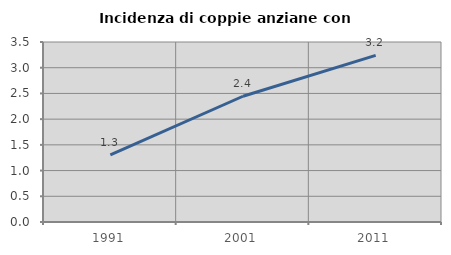
| Category | Incidenza di coppie anziane con figli |
|---|---|
| 1991.0 | 1.307 |
| 2001.0 | 2.445 |
| 2011.0 | 3.241 |